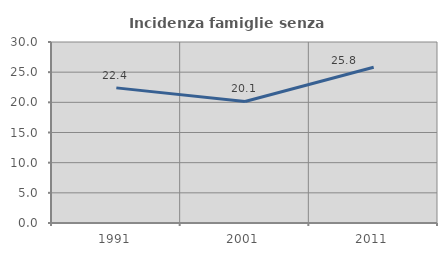
| Category | Incidenza famiglie senza nuclei |
|---|---|
| 1991.0 | 22.397 |
| 2001.0 | 20.147 |
| 2011.0 | 25.808 |